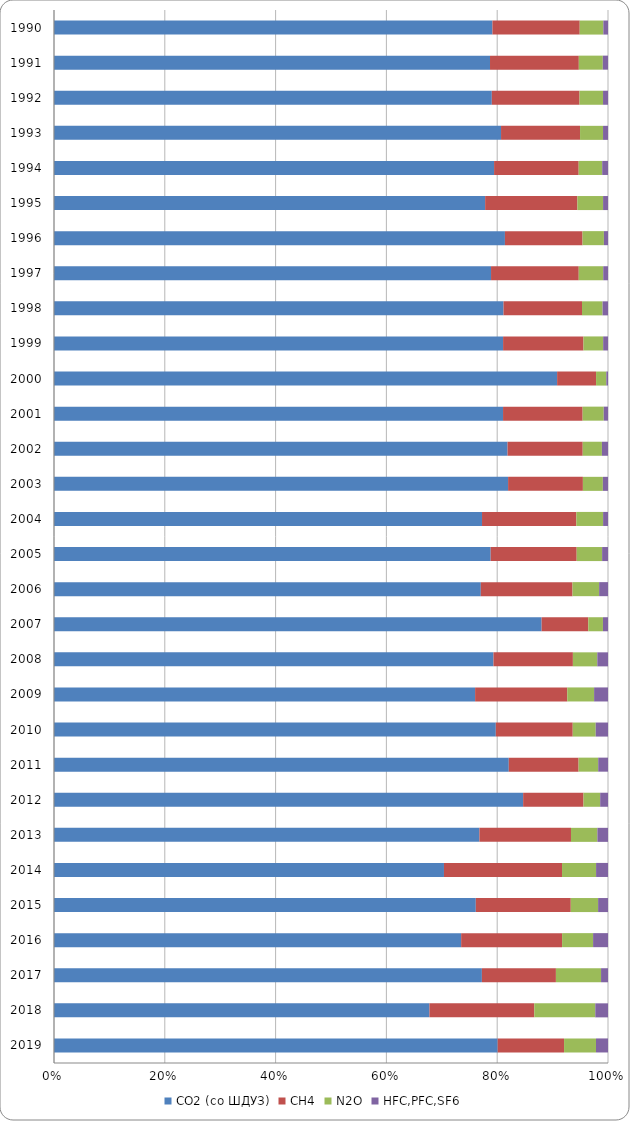
| Category | CO2 (со ШДУЗ) | CH4 | N2O | HFC,PFC,SF6 |
|---|---|---|---|---|
| 1990.0 | 8601.951 | 1713.194 | 462.8 | 91.655 |
| 1991.0 | 8409.246 | 1712.925 | 462.645 | 100.124 |
| 1992.0 | 8520.062 | 1707.04 | 457.122 | 96.649 |
| 1993.0 | 9704.606 | 1715.084 | 499.019 | 107.858 |
| 1994.0 | 8891.494 | 1709.661 | 474.884 | 117.162 |
| 1995.0 | 7962.173 | 1703.808 | 474.113 | 90.953 |
| 1996.0 | 9777.024 | 1682.575 | 463.243 | 88.782 |
| 1997.0 | 8176.557 | 1640.998 | 457.788 | 89.383 |
| 1998.0 | 9091.339 | 1587.09 | 416.107 | 109.662 |
| 1999.0 | 8815.445 | 1577.851 | 386.427 | 95.113 |
| 2000.0 | 20292.776 | 1571.117 | 413.76 | 67.628 |
| 2001.0 | 8797.911 | 1559.497 | 412.993 | 83.726 |
| 2002.0 | 9270.809 | 1536.777 | 392.3 | 124.174 |
| 2003.0 | 9279.596 | 1528.656 | 408.116 | 104.799 |
| 2004.0 | 6982.16 | 1538.649 | 436.475 | 79.919 |
| 2005.0 | 7660.913 | 1509.378 | 445.917 | 103.179 |
| 2006.0 | 7157.85 | 1537.838 | 446.304 | 148.807 |
| 2007.0 | 15341.95 | 1468.553 | 461.206 | 158.587 |
| 2008.0 | 8394.347 | 1517.01 | 465.92 | 204.541 |
| 2009.0 | 6760.738 | 1479.605 | 430.79 | 223.126 |
| 2010.0 | 8652.771 | 1506.726 | 449.739 | 240.611 |
| 2011.0 | 10451.462 | 1604.506 | 450.63 | 225.028 |
| 2012.0 | 12154.37 | 1563.841 | 432.221 | 202.611 |
| 2013.0 | 7109.912 | 1530.346 | 441.241 | 177.485 |
| 2014.0 | 5159.404 | 1561.998 | 450.458 | 157.794 |
| 2015.0 | 7080.431 | 1594.271 | 458.793 | 165.916 |
| 2016.0 | 6396.435 | 1585.772 | 487.022 | 234.24 |
| 2017.0 | 9483.101 | 1640.381 | 1000.349 | 153.874 |
| 2018.0 | 5857.776 | 1635.649 | 951.853 | 198.422 |
| 2019.0 | 10332.546 | 1546.071 | 744.444 | 278.879 |